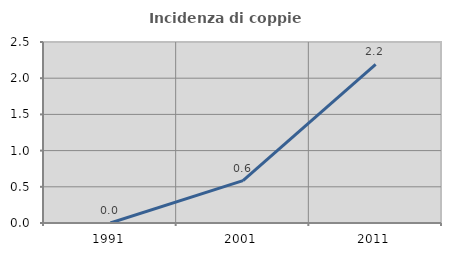
| Category | Incidenza di coppie miste |
|---|---|
| 1991.0 | 0 |
| 2001.0 | 0.585 |
| 2011.0 | 2.19 |